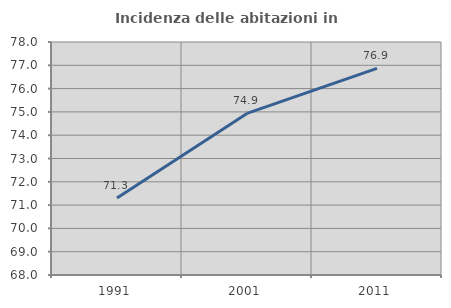
| Category | Incidenza delle abitazioni in proprietà  |
|---|---|
| 1991.0 | 71.308 |
| 2001.0 | 74.936 |
| 2011.0 | 76.871 |